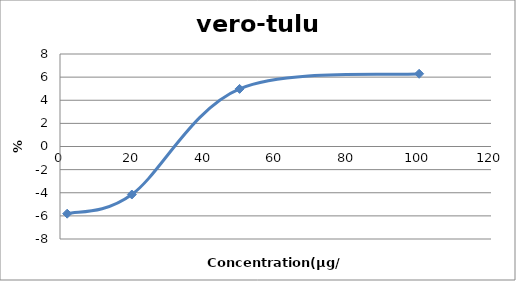
| Category | vero-tulu4 |
|---|---|
| 100.0 | 6.29 |
| 50.0 | 4.982 |
| 20.0 | -4.153 |
| 2.0 | -5.811 |
| nan | 0 |
| nan | 0 |
| nan | 0 |
| nan | 0 |
| nan | 0 |